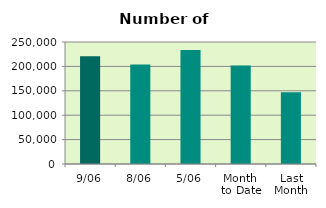
| Category | Series 0 |
|---|---|
| 9/06 | 220914 |
| 8/06 | 203704 |
| 5/06 | 233772 |
| Month 
to Date | 201981.143 |
| Last
Month | 147277.8 |